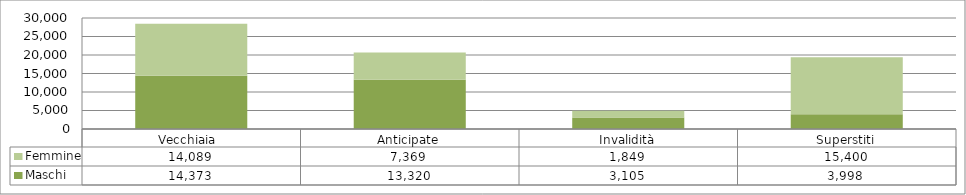
| Category | Maschi | Femmine |
|---|---|---|
| Vecchiaia  | 14373 | 14089 |
| Anticipate | 13320 | 7369 |
| Invalidità | 3105 | 1849 |
| Superstiti | 3998 | 15400 |